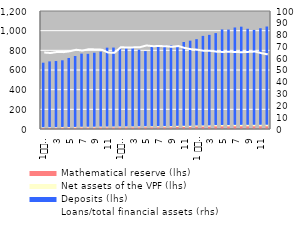
| Category | Mathematical reserve (lhs) | Net assets of the VPF (lhs) | Deposits (lhs) |
|---|---|---|---|
| 1
2010 | 20.312 | 7.432 | 646.512 |
| 2 | 20.312 | 7.676 | 659.663 |
| 3 | 20.312 | 7.899 | 662.954 |
| 4 | 22.604 | 8.15 | 667.872 |
| 5 | 22.604 | 8.327 | 691.436 |
| 6 | 22.604 | 8.568 | 711.138 |
| 7 | 24.18 | 8.841 | 733.467 |
| 8 | 24.18 | 8.995 | 731.517 |
| 9 | 24.18 | 9.206 | 742.22 |
| 10 | 25.593 | 9.488 | 751.29 |
| 11 | 25.593 | 9.639 | 791.892 |
| 12 | 25.593 | 9.863 | 792.868 |
| 1
2011 | 26.141 | 10.082 | 788.105 |
| 2 | 26.141 | 10.238 | 785.305 |
| 3 | 26.141 | 10.435 | 789.147 |
| 4 | 27.221 | 10.51 | 768.584 |
| 5 | 27.221 | 10.725 | 754.057 |
| 6 | 27.221 | 11.067 | 802.026 |
| 7 | 27.991 | 11.306 | 810.238 |
| 8 | 27.991 | 11.45 | 809.643 |
| 9 | 27.991 | 11.587 | 811.768 |
| 10 | 30.667 | 11.853 | 801.997 |
| 11 | 30.667 | 12.123 | 841.906 |
| 12 | 30.667 | 12.452 | 855.201 |
| 1 
2012 | 33.6 | 12.722 | 867.345 |
| 2 | 33.6 | 13.086 | 900.268 |
| 3 | 33.6 | 13.424 | 910.443 |
| 4 | 36.615 | 13.664 | 924.967 |
| 5 | 36.615 | 13.998 | 961.915 |
| 6 | 36.615 | 14.251 | 960.12 |
| 7 | 37.538 | 14.626 | 980.33 |
| 8 | 37.538 | 14.843 | 988.17 |
| 9 | 37.538 | 14.949 | 966.85 |
| 10 | 37.538 | 15.164 | 954.969 |
| 11 | 37.538 | 15.488 | 971.886 |
| 12 | 37.538 | 16.011 | 988.759 |